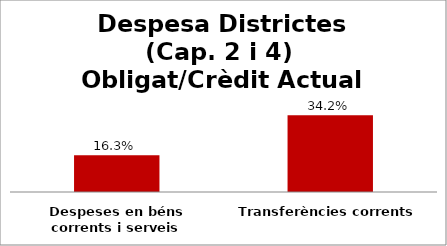
| Category | Series 0 |
|---|---|
| Despeses en béns corrents i serveis | 0.163 |
| Transferències corrents | 0.342 |